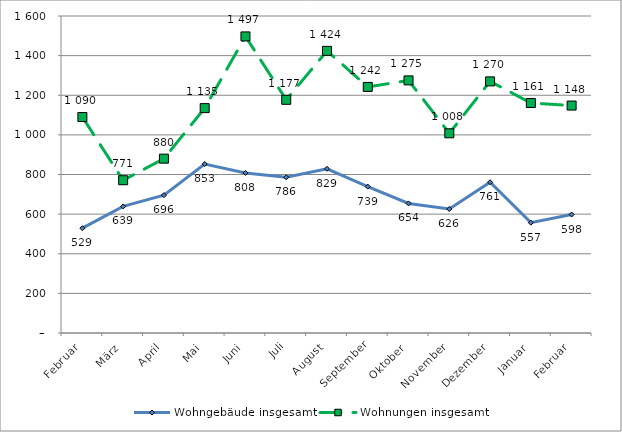
| Category | Wohngebäude insgesamt | Wohnungen insgesamt |
|---|---|---|
| Februar | 529 | 1090 |
| März | 639 | 771 |
| April | 696 | 880 |
| Mai | 853 | 1135 |
| Juni | 808 | 1497 |
| Juli | 786 | 1177 |
| August | 829 | 1424 |
| September | 739 | 1242 |
| Oktober | 654 | 1275 |
| November | 626 | 1008 |
| Dezember | 761 | 1270 |
| Januar | 557 | 1161 |
| Februar | 598 | 1148 |